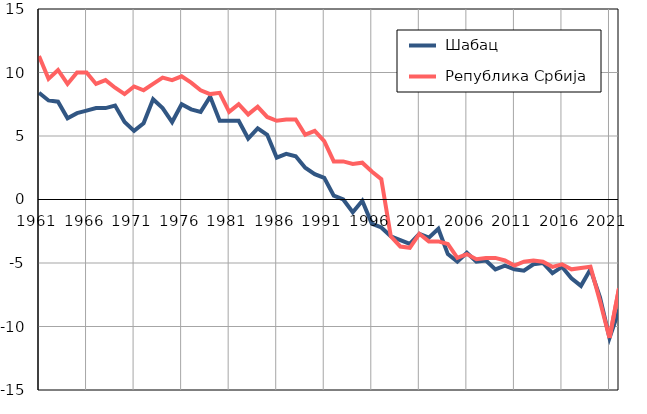
| Category |  Шабац |  Република Србија |
|---|---|---|
| 1961.0 | 8.4 | 11.3 |
| 1962.0 | 7.8 | 9.5 |
| 1963.0 | 7.7 | 10.2 |
| 1964.0 | 6.4 | 9.1 |
| 1965.0 | 6.8 | 10 |
| 1966.0 | 7 | 10 |
| 1967.0 | 7.2 | 9.1 |
| 1968.0 | 7.2 | 9.4 |
| 1969.0 | 7.4 | 8.8 |
| 1970.0 | 6.1 | 8.3 |
| 1971.0 | 5.4 | 8.9 |
| 1972.0 | 6 | 8.6 |
| 1973.0 | 7.9 | 9.1 |
| 1974.0 | 7.2 | 9.6 |
| 1975.0 | 6.1 | 9.4 |
| 1976.0 | 7.5 | 9.7 |
| 1977.0 | 7.1 | 9.2 |
| 1978.0 | 6.9 | 8.6 |
| 1979.0 | 8.1 | 8.3 |
| 1980.0 | 6.2 | 8.4 |
| 1981.0 | 6.2 | 6.9 |
| 1982.0 | 6.2 | 7.5 |
| 1983.0 | 4.8 | 6.7 |
| 1984.0 | 5.6 | 7.3 |
| 1985.0 | 5.1 | 6.5 |
| 1986.0 | 3.3 | 6.2 |
| 1987.0 | 3.6 | 6.3 |
| 1988.0 | 3.4 | 6.3 |
| 1989.0 | 2.5 | 5.1 |
| 1990.0 | 2 | 5.4 |
| 1991.0 | 1.7 | 4.6 |
| 1992.0 | 0.3 | 3 |
| 1993.0 | 0 | 3 |
| 1994.0 | -1 | 2.8 |
| 1995.0 | -0.1 | 2.9 |
| 1996.0 | -1.9 | 2.2 |
| 1997.0 | -2.2 | 1.6 |
| 1998.0 | -2.9 | -2.9 |
| 1999.0 | -3.2 | -3.7 |
| 2000.0 | -3.5 | -3.8 |
| 2001.0 | -2.7 | -2.7 |
| 2002.0 | -3 | -3.3 |
| 2003.0 | -2.3 | -3.3 |
| 2004.0 | -4.3 | -3.5 |
| 2005.0 | -4.9 | -4.6 |
| 2006.0 | -4.2 | -4.3 |
| 2007.0 | -4.9 | -4.7 |
| 2008.0 | -4.8 | -4.6 |
| 2009.0 | -5.5 | -4.6 |
| 2010.0 | -5.2 | -4.8 |
| 2011.0 | -5.5 | -5.2 |
| 2012.0 | -5.6 | -4.9 |
| 2013.0 | -5.1 | -4.8 |
| 2014.0 | -5 | -4.9 |
| 2015.0 | -5.8 | -5.3 |
| 2016.0 | -5.3 | -5.1 |
| 2017.0 | -6.2 | -5.5 |
| 2018.0 | -6.8 | -5.4 |
| 2019.0 | -5.5 | -5.3 |
| 2020.0 | -7.7 | -8 |
| 2021.0 | -10.9 | -10.9 |
| 2022.0 | -8.7 | -7 |